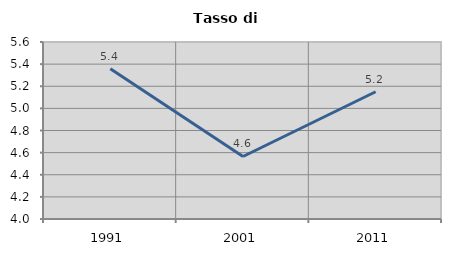
| Category | Tasso di disoccupazione   |
|---|---|
| 1991.0 | 5.359 |
| 2001.0 | 4.565 |
| 2011.0 | 5.15 |